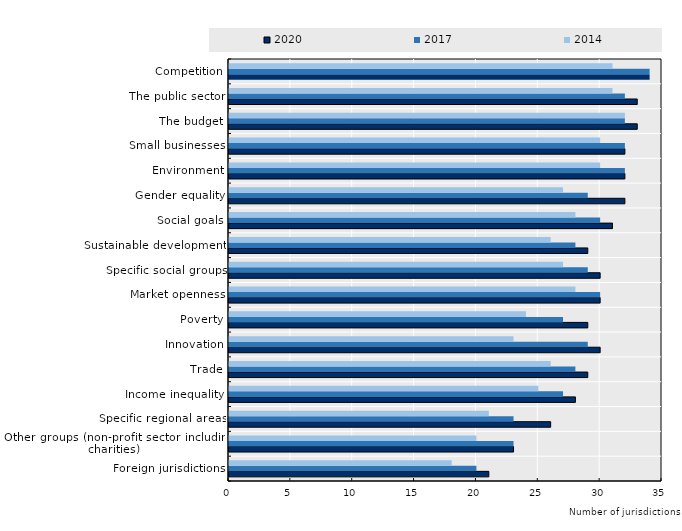
| Category | 2020 | 2017 | 2014 |
|---|---|---|---|
| Foreign jurisdictions | 21 | 20 | 18 |
| Other groups (non-profit sector including charities) | 23 | 23 | 20 |
| Specific regional areas | 26 | 23 | 21 |
| Income inequality | 28 | 27 | 25 |
| Trade | 29 | 28 | 26 |
| Innovation | 30 | 29 | 23 |
| Poverty | 29 | 27 | 24 |
| Market openness | 30 | 30 | 28 |
| Specific social groups | 30 | 29 | 27 |
| Sustainable development | 29 | 28 | 26 |
| Social goals | 31 | 30 | 28 |
| Gender equality | 32 | 29 | 27 |
| Environment | 32 | 32 | 30 |
| Small businesses | 32 | 32 | 30 |
| The budget | 33 | 32 | 32 |
| The public sector | 33 | 32 | 31 |
| Competition | 34 | 34 | 31 |